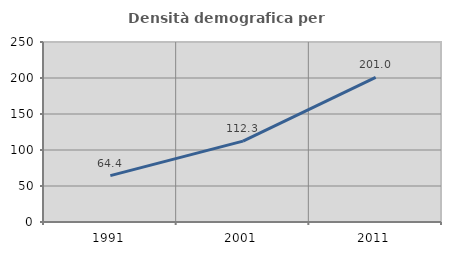
| Category | Densità demografica |
|---|---|
| 1991.0 | 64.382 |
| 2001.0 | 112.294 |
| 2011.0 | 200.965 |